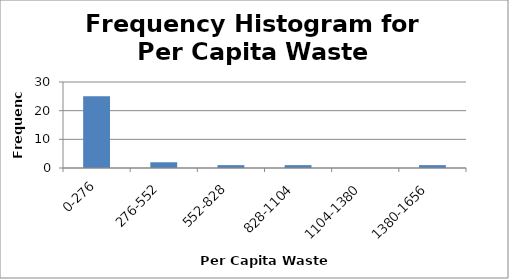
| Category | Series 0 |
|---|---|
| 0-276 | 25 |
| 276-552 | 2 |
| 552-828 | 1 |
| 828-1104 | 1 |
| 1104-1380 | 0 |
| 1380-1656 | 1 |